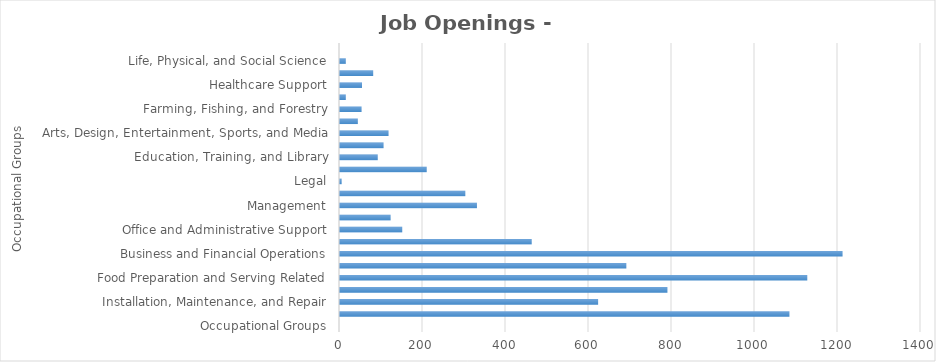
| Category | Series1 |
|---|---|
| Occupational Groups | 0 |
| Construction and Extraction | 1083 |
| Installation, Maintenance, and Repair | 622 |
| Building and Grounds Cleaning and Maintenance | 789 |
| Food Preparation and Serving Related | 1126 |
| Personal Care and Service | 690 |
| Business and Financial Operations | 1211 |
| Sales and Related | 462 |
| Office and Administrative Support | 150 |
| Architecture and Engineering | 122 |
| Management | 330 |
| Transportation and Material Moving | 302 |
| Legal | 4 |
| Healthcare Practitioners and Technical | 209 |
| Education, Training, and Library | 91 |
| Production | 105 |
| Arts, Design, Entertainment, Sports, and Media | 117 |
| Computer and Mathematical | 43 |
| Farming, Fishing, and Forestry | 52 |
| Community and Social Services | 14 |
| Healthcare Support | 53 |
| Protective Service | 80 |
| Life, Physical, and Social Science | 14 |
| Military Specific  | 0 |